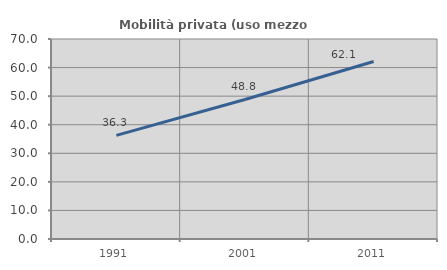
| Category | Mobilità privata (uso mezzo privato) |
|---|---|
| 1991.0 | 36.281 |
| 2001.0 | 48.834 |
| 2011.0 | 62.136 |